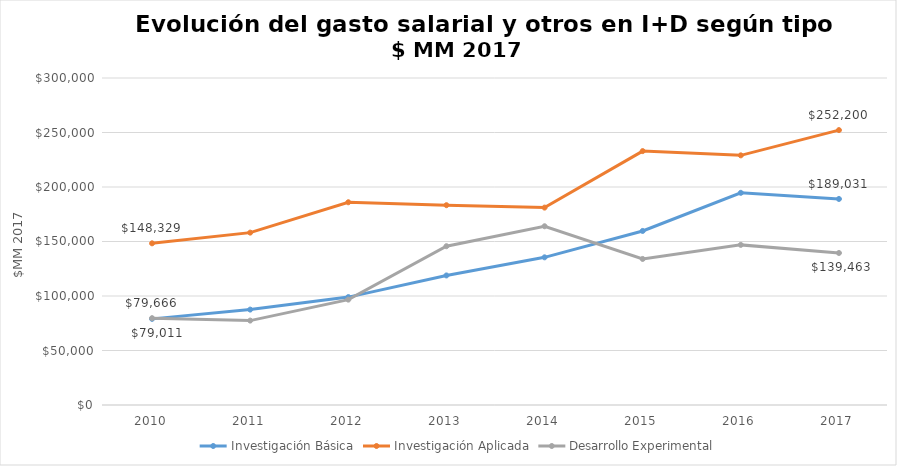
| Category | Investigación Básica | Investigación Aplicada | Desarrollo Experimental |
|---|---|---|---|
| 2010.0 | 79011.38 | 148329.366 | 79665.788 |
| 2011.0 | 87526.951 | 158138.075 | 77437.549 |
| 2012.0 | 98998.858 | 186000.83 | 96675.701 |
| 2013.0 | 118858.023 | 183301.159 | 145676.214 |
| 2014.0 | 135480.275 | 181098.789 | 163989.859 |
| 2015.0 | 159678.063 | 232929.463 | 133998.586 |
| 2016.0 | 194661.207 | 229038.62 | 146897.797 |
| 2017.0 | 189031.395 | 252199.528 | 139462.876 |